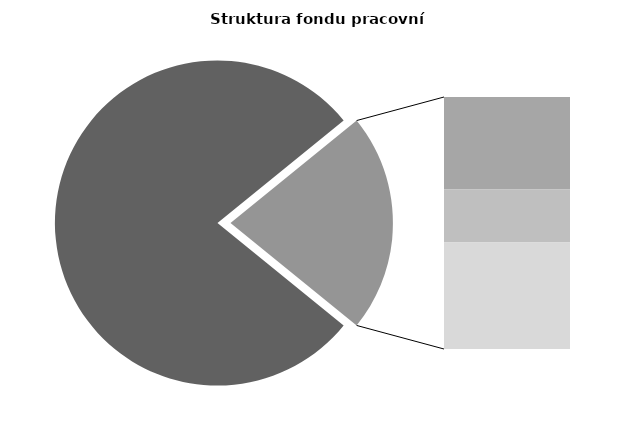
| Category | Series 0 |
|---|---|
| Průměrná měsíční odpracovaná doba bez přesčasu | 133.609 |
| Dovolená | 13.594 |
| Nemoc | 7.818 |
| Jiné | 15.647 |